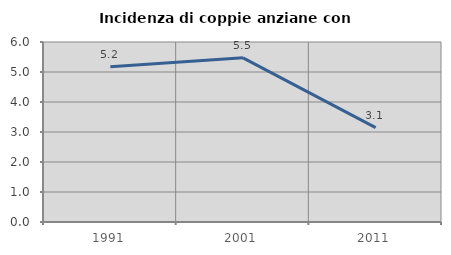
| Category | Incidenza di coppie anziane con figli |
|---|---|
| 1991.0 | 5.172 |
| 2001.0 | 5.473 |
| 2011.0 | 3.145 |